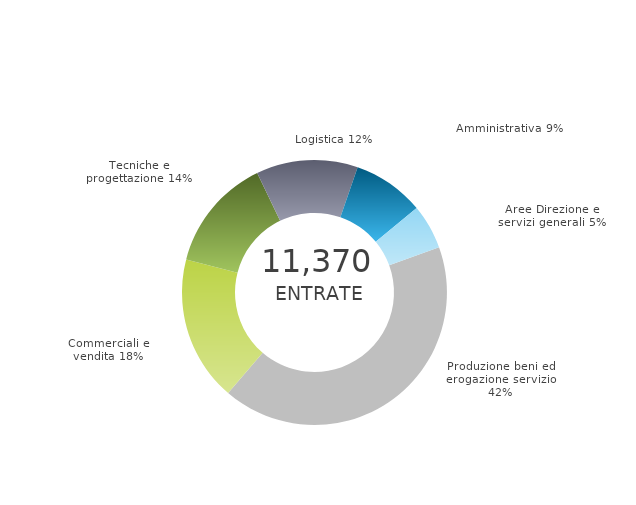
| Category | Series 0 | Series 1 |
|---|---|---|
| Produzione beni ed erogazione servizio | 0 | 0.419 |
| Commerciali e vendita | 0 | 0.177 |
| Tecniche e progettazione | 0 | 0.139 |
| Logistica | 0 | 0.124 |
| Amministrativa | 0 | 0.087 |
| Aree Direzione e servizi generali | 0 | 0.054 |